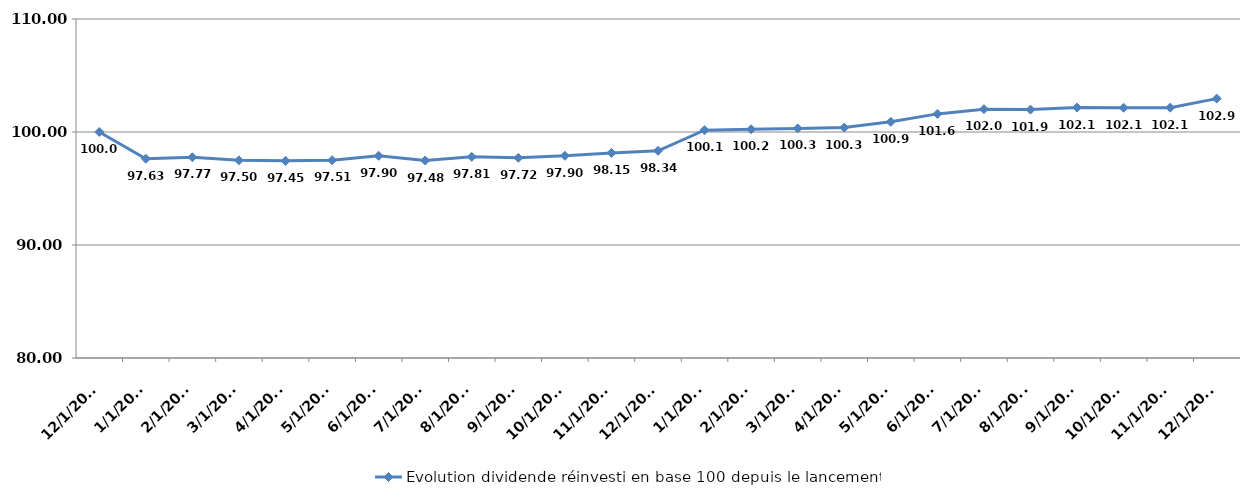
| Category |  Evolution dividende réinvesti en base 100 depuis le lancement  |
|---|---|
| 12/1/17 | 100 |
| 1/1/18 | 97.627 |
| 2/1/18 | 97.767 |
| 3/1/18 | 97.496 |
| 4/1/18 | 97.446 |
| 5/1/18 | 97.507 |
| 6/1/18 | 97.897 |
| 7/1/18 | 97.476 |
| 8/1/18 | 97.807 |
| 9/1/18 | 97.717 |
| 10/1/18 | 97.897 |
| 11/1/18 | 98.147 |
| 12/1/18 | 98.338 |
| 1/1/19 | 100.16 |
| 2/1/19 | 100.24 |
| 3/1/19 | 100.32 |
| 4/1/19 | 100.391 |
| 5/1/19 | 100.901 |
| 6/1/19 | 101.602 |
| 7/1/19 | 102.023 |
| 8/1/19 | 101.983 |
| 9/1/19 | 102.163 |
| 10/1/19 | 102.143 |
| 11/1/19 | 102.153 |
| 12/1/19 | 102.954 |